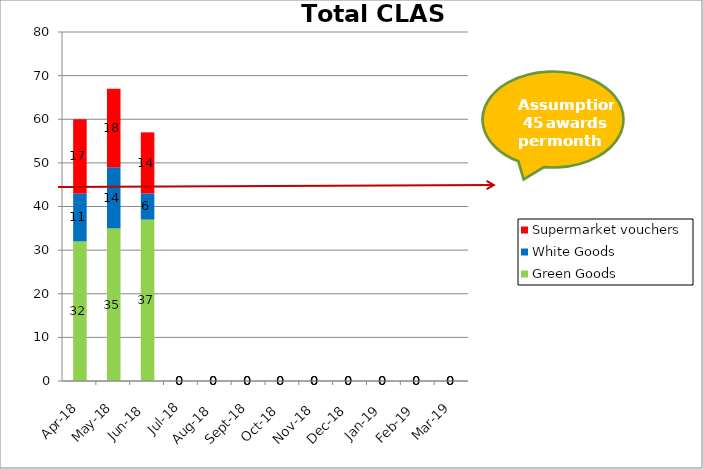
| Category | Green Goods | White Goods | Supermarket vouchers |
|---|---|---|---|
| 2018-04-01 | 32 | 11 | 17 |
| 2018-05-01 | 35 | 14 | 18 |
| 2018-06-01 | 37 | 6 | 14 |
| 2018-07-01 | 0 | 0 | 0 |
| 2018-08-01 | 0 | 0 | 0 |
| 2018-09-01 | 0 | 0 | 0 |
| 2018-10-01 | 0 | 0 | 0 |
| 2018-11-01 | 0 | 0 | 0 |
| 2018-12-01 | 0 | 0 | 0 |
| 2019-01-01 | 0 | 0 | 0 |
| 2019-02-01 | 0 | 0 | 0 |
| 2019-03-01 | 0 | 0 | 0 |